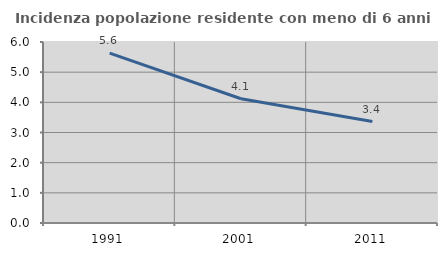
| Category | Incidenza popolazione residente con meno di 6 anni |
|---|---|
| 1991.0 | 5.633 |
| 2001.0 | 4.12 |
| 2011.0 | 3.361 |